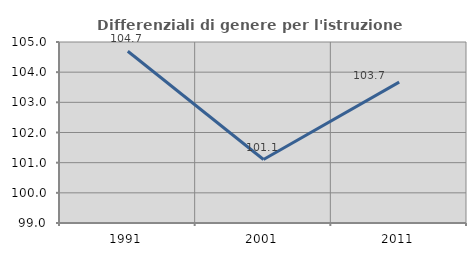
| Category | Differenziali di genere per l'istruzione superiore |
|---|---|
| 1991.0 | 104.693 |
| 2001.0 | 101.104 |
| 2011.0 | 103.669 |